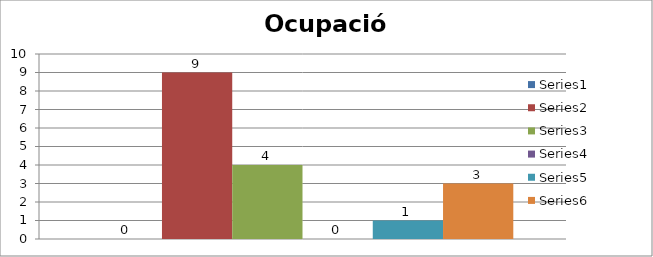
| Category | Series 0 | Series 1 | Series 2 | Series 3 | Series 4 | Series 5 |
|---|---|---|---|---|---|---|
| 0 | 0 | 9 | 4 | 0 | 1 | 3 |